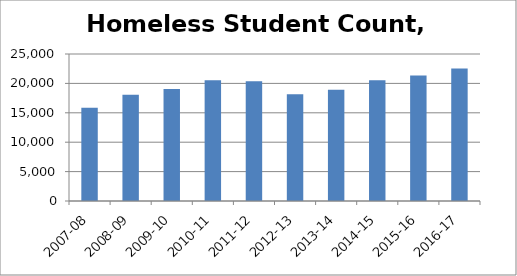
| Category | Homeless Students* |
|---|---|
| 2007-08 | 15859 |
| 2008-09 | 18051 |
| 2009-10 | 19040 |
| 2010-11 | 20545 |
| 2011-12 | 20370 |
| 2012-13 | 18165 |
| 2013-14 | 18902 |
| 2014-15 | 20524 |
| 2015-16 | 21340 |
| 2016-17 | 22541 |